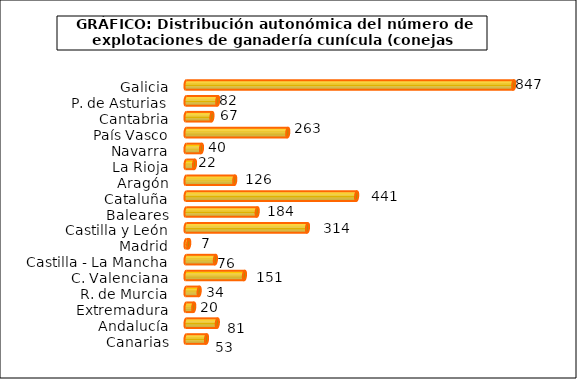
| Category | num. Explotaciones |
|---|---|
|   Galicia | 847 |
|   P. de Asturias | 82 |
|   Cantabria | 67 |
|   País Vasco | 263 |
|   Navarra | 40 |
|   La Rioja | 22 |
|   Aragón | 126 |
|   Cataluña | 441 |
|   Baleares | 184 |
|   Castilla y León | 314 |
|   Madrid | 7 |
|   Castilla - La Mancha | 76 |
|   C. Valenciana | 151 |
|   R. de Murcia | 34 |
|   Extremadura | 20 |
|   Andalucía | 81 |
|   Canarias | 53 |